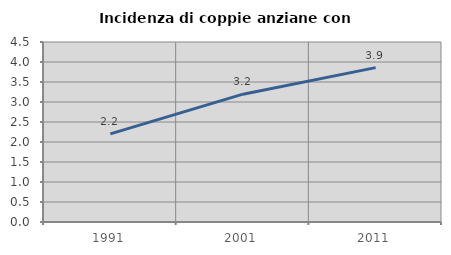
| Category | Incidenza di coppie anziane con figli |
|---|---|
| 1991.0 | 2.204 |
| 2001.0 | 3.196 |
| 2011.0 | 3.859 |